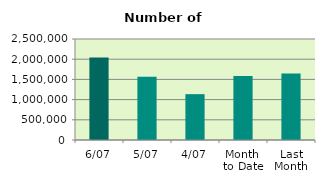
| Category | Series 0 |
|---|---|
| 6/07 | 2039972 |
| 5/07 | 1568104 |
| 4/07 | 1134638 |
| Month 
to Date | 1583621.5 |
| Last
Month | 1646651.818 |